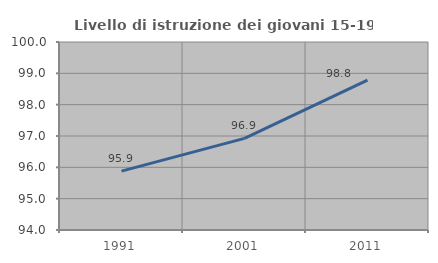
| Category | Livello di istruzione dei giovani 15-19 anni |
|---|---|
| 1991.0 | 95.879 |
| 2001.0 | 96.923 |
| 2011.0 | 98.785 |